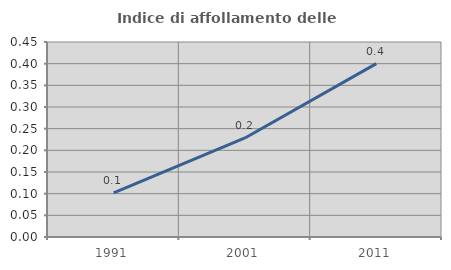
| Category | Indice di affollamento delle abitazioni  |
|---|---|
| 1991.0 | 0.102 |
| 2001.0 | 0.229 |
| 2011.0 | 0.4 |